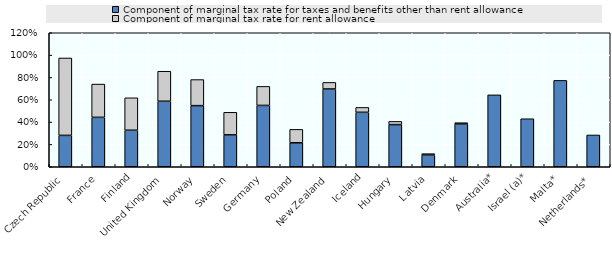
| Category | Component of marginal tax rate for taxes and benefits other than rent allowance | Component of marginal tax rate for rent allowance |
|---|---|---|
| Czech Republic | 0.281 | 0.693 |
| France | 0.442 | 0.298 |
| Finland | 0.327 | 0.291 |
| United Kingdom | 0.587 | 0.269 |
| Norway | 0.547 | 0.234 |
| Sweden | 0.286 | 0.202 |
| Germany | 0.549 | 0.17 |
| Poland | 0.215 | 0.12 |
| New Zealand | 0.697 | 0.059 |
| Iceland | 0.488 | 0.044 |
| Hungary | 0.378 | 0.029 |
| Latvia | 0.105 | 0.012 |
| Denmark | 0.383 | 0.011 |
| Australia* | 0.644 | 0 |
| Israel (a)* | 0.43 | 0 |
| Malta* | 0.773 | 0 |
| Netherlands* | 0.285 | 0 |